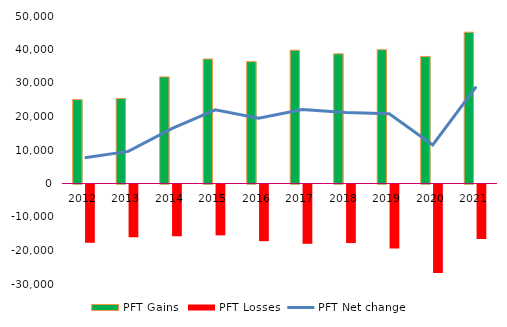
| Category | PFT Gains  | PFT Losses |
|---|---|---|
| 2012.0 | 25079 | -17398 |
| 2013.0 | 25346 | -15759 |
| 2014.0 | 31824 | -15452 |
| 2015.0 | 37160 | -15179 |
| 2016.0 | 36378 | -16916 |
| 2017.0 | 39769 | -17702 |
| 2018.0 | 38706 | -17484 |
| 2019.0 | 39946 | -19102 |
| 2020.0 | 37917 | -26414 |
| 2021.0 | 45176 | -16267 |